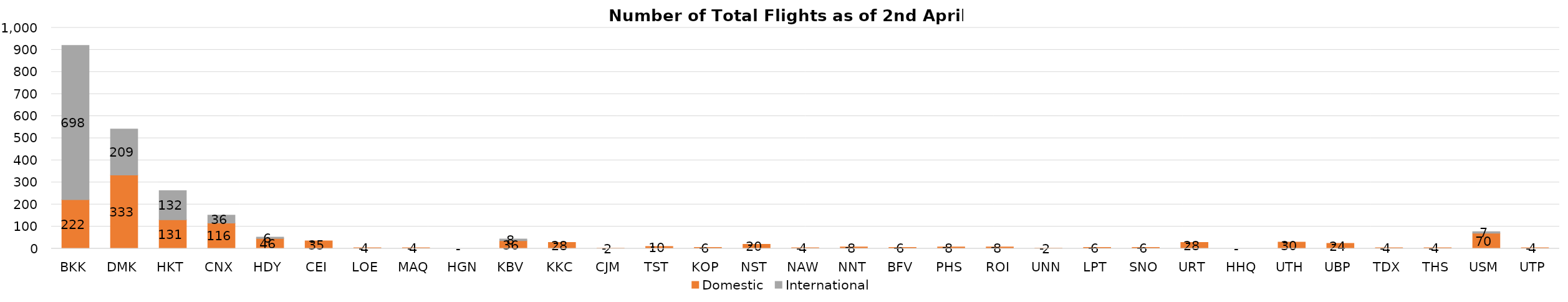
| Category | Domestic | International |
|---|---|---|
| BKK | 222 | 698 |
| DMK | 333 | 209 |
| HKT | 131 | 132 |
| CNX | 116 | 36 |
| HDY | 46 | 6 |
| CEI | 35 | 0 |
| LOE | 4 | 0 |
| MAQ | 4 | 0 |
| HGN | 0 | 0 |
| KBV | 36 | 8 |
| KKC | 28 | 0 |
| CJM | 2 | 0 |
| TST | 10 | 0 |
| KOP | 6 | 0 |
| NST | 20 | 0 |
| NAW | 4 | 0 |
| NNT | 8 | 0 |
| BFV | 6 | 0 |
| PHS | 8 | 0 |
| ROI | 8 | 0 |
| UNN | 2 | 0 |
| LPT | 6 | 0 |
| SNO | 6 | 0 |
| URT | 28 | 0 |
| HHQ | 0 | 0 |
| UTH | 30 | 0 |
| UBP | 24 | 0 |
| TDX | 4 | 0 |
| THS | 4 | 0 |
| USM | 70 | 7 |
| UTP | 4 | 0 |